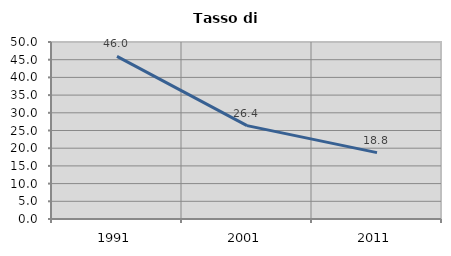
| Category | Tasso di disoccupazione   |
|---|---|
| 1991.0 | 45.952 |
| 2001.0 | 26.383 |
| 2011.0 | 18.754 |